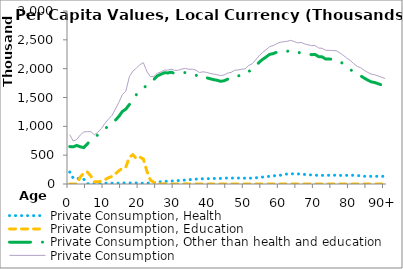
| Category | Private Consumption, Health | Private Consumption, Education | Private Consumption, Other than health and education | Private Consumption |
|---|---|---|---|---|
| 0 | 206204.031 | 0 | 648601.28 | 854805.311 |
|  | 100084.61 | 0 | 644952.096 | 745036.707 |
| 2 | 101863.525 | 0 | 668757.569 | 770621.093 |
| 3 | 83468.669 | 120450.11 | 645437.299 | 849356.078 |
| 4 | 82868.672 | 189525.4 | 630836.098 | 903230.17 |
| 5 | 4965.243 | 208868.809 | 693436.047 | 907270.099 |
| 6 | 5031.949 | 139807.212 | 764637.12 | 909476.282 |
| 7 | 5265.516 | 37579.573 | 809895.103 | 852740.193 |
| 8 | 5304.014 | 37874.891 | 851490.279 | 894669.185 |
| 9 | 4819.234 | 48881.593 | 907177.255 | 960878.082 |
| 10 | 13651.247 | 73837.575 | 960258.055 | 1047746.877 |
| 11 | 14985.146 | 107395.716 | 999739.199 | 1122120.061 |
| 12 | 13939.022 | 130682.583 | 1040801.589 | 1185423.194 |
| 13 | 13252.058 | 175940.084 | 1106805.676 | 1295997.818 |
| 14 | 14897.991 | 228971.107 | 1170971.24 | 1414840.338 |
| 15 | 19075.488 | 272237.89 | 1257415.602 | 1548728.981 |
| 16 | 17651.174 | 293228.089 | 1298793.879 | 1609673.142 |
| 17 | 18141.697 | 463382.159 | 1377734.671 | 1859258.527 |
| 18 | 17282.935 | 507838.41 | 1431683.664 | 1956805.009 |
| 19 | 18802.1 | 439053.024 | 1550611.228 | 2008466.352 |
| 20 | 13628.299 | 466463.818 | 1588374.862 | 2068466.979 |
| 21 | 13443.564 | 431267.415 | 1658614.084 | 2103325.062 |
| 22 | 12563.766 | 224348.244 | 1716624.666 | 1953536.676 |
| 23 | 18939.901 | 67799.12 | 1772131.117 | 1858870.138 |
| 24 | 25790.026 | 27979.553 | 1813096.116 | 1866865.695 |
| 25 | 33376.464 | 12073.178 | 1874447.321 | 1919896.964 |
| 26 | 38897.237 | 928.693 | 1903299.565 | 1943125.495 |
| 27 | 44523.675 | 2942.275 | 1927903.49 | 1975369.439 |
| 28 | 48081.77 | 769.431 | 1926599.87 | 1975451.071 |
| 29 | 50914.182 | 190.012 | 1938770.871 | 1989875.065 |
| 30 | 55481.374 | 1035.595 | 1913482.142 | 1969999.111 |
| 31 | 59373.097 | 170.283 | 1912857.837 | 1972401.217 |
| 32 | 64393.398 | 765.761 | 1929708.284 | 1994867.443 |
| 33 | 68775.136 | 2475.089 | 1932711.722 | 2003961.947 |
| 34 | 74846.705 | 1318.406 | 1912348.727 | 1988513.837 |
| 35 | 78625.296 | 627.904 | 1912334.554 | 1991587.754 |
| 36 | 84136.24 | 141.605 | 1889388.142 | 1973665.987 |
| 37 | 89549.726 | 1595.424 | 1842328.81 | 1933473.96 |
| 38 | 91316.257 | 0 | 1854059.958 | 1945376.215 |
| 39 | 92507.547 | 133.901 | 1843017.302 | 1935658.749 |
| 40 | 93269.887 | 0 | 1826418.508 | 1919688.394 |
| 41 | 95773.578 | 36.652 | 1810042.031 | 1905852.261 |
| 42 | 96008.62 | 0 | 1799282.262 | 1895290.882 |
| 43 | 97407.139 | 440.107 | 1781580.833 | 1879428.079 |
| 44 | 99041.862 | 356.122 | 1789424.758 | 1888822.742 |
| 45 | 104542.094 | 363.794 | 1816694.772 | 1921600.66 |
| 46 | 103631.307 | 1949.638 | 1829487.408 | 1935068.353 |
| 47 | 102070.728 | 0 | 1869049.975 | 1971120.703 |
| 48 | 103011.821 | 0 | 1873969.165 | 1976980.986 |
| 49 | 102839.289 | 0 | 1887169.816 | 1990009.104 |
| 50 | 100944.891 | 0 | 1896106.597 | 1997051.488 |
| 51 | 101223.333 | 1249.823 | 1951042.649 | 2053515.804 |
| 52 | 102914.137 | 104.999 | 1980268.659 | 2083287.796 |
| 53 | 106665.178 | 80.343 | 2042180.586 | 2148926.106 |
| 54 | 112340.447 | 0 | 2109884.613 | 2222225.06 |
| 55 | 119959.68 | 0 | 2159892.828 | 2279852.508 |
| 56 | 127145.142 | 0 | 2201667.909 | 2328813.051 |
| 57 | 133776.132 | 0 | 2247132.767 | 2380908.9 |
| 58 | 139166.653 | 82.896 | 2260550.156 | 2399799.704 |
| 59 | 147790 | 0 | 2284015.941 | 2431805.941 |
| 60 | 151621.951 | 0 | 2305484.404 | 2457106.355 |
| 61 | 163789.152 | 0 | 2301950.711 | 2465739.863 |
| 62 | 173291.84 | 304.773 | 2300877.229 | 2474473.843 |
| 63 | 177180.208 | 0 | 2314060.893 | 2491241.101 |
| 64 | 175564.858 | 7.888 | 2295804.191 | 2471376.937 |
| 65 | 174835.387 | 4.463 | 2273158.504 | 2447998.354 |
| 66 | 171014.079 | 14.538 | 2283494.552 | 2454523.169 |
| 67 | 165300.565 | 64.611 | 2263026.675 | 2428391.851 |
| 68 | 160247.381 | 0 | 2253931.09 | 2414178.472 |
| 69 | 157008.421 | 0 | 2242642.244 | 2399650.665 |
| 70 | 154169.886 | 0 | 2245691.317 | 2399861.203 |
| 71 | 148751.321 | 0 | 2208860.248 | 2357611.569 |
| 72 | 149233.395 | 0 | 2204490.713 | 2353724.108 |
| 73 | 151712.291 | 0 | 2166973.851 | 2318686.142 |
| 74 | 151660.286 | 0 | 2166197.585 | 2317857.87 |
| 75 | 150009.055 | 0 | 2163862.149 | 2313871.204 |
| 76 | 154491.589 | 10.653 | 2156845.606 | 2311347.848 |
| 77 | 149759.492 | 0 | 2125750.998 | 2275510.49 |
| 78 | 146652.656 | 0 | 2086187.746 | 2232840.403 |
| 79 | 150253.897 | 0 | 2034904.767 | 2185158.664 |
| 80 | 155153.922 | 0 | 1988596.223 | 2143750.145 |
| 81 | 148211.42 | 0 | 1938392.079 | 2086603.499 |
| 82 | 146722.747 | 0 | 1892958.125 | 2039680.872 |
| 83 | 142694.935 | 0 | 1873864.723 | 2016559.658 |
| 84 | 133571.838 | 0 | 1837118.806 | 1970690.644 |
| 85 | 133571.838 | 0 | 1801780.378 | 1935352.216 |
| 86 | 133571.838 | 0 | 1771089.074 | 1904660.912 |
| 87 | 133571.838 | 0 | 1760472.21 | 1894044.048 |
| 88 | 133571.838 | 0 | 1738404.575 | 1871976.413 |
| 89 | 133571.838 | 0 | 1716863.753 | 1850435.591 |
| 90+ | 133571.838 | 0 | 1695322.93 | 1828894.768 |